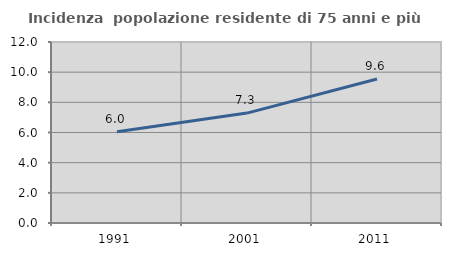
| Category | Incidenza  popolazione residente di 75 anni e più |
|---|---|
| 1991.0 | 6.047 |
| 2001.0 | 7.286 |
| 2011.0 | 9.551 |